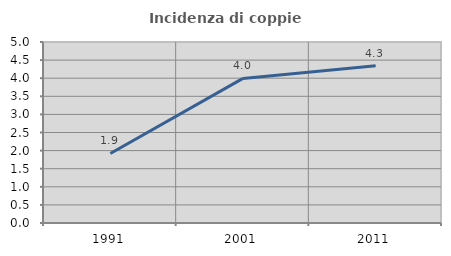
| Category | Incidenza di coppie miste |
|---|---|
| 1991.0 | 1.92 |
| 2001.0 | 3.994 |
| 2011.0 | 4.342 |